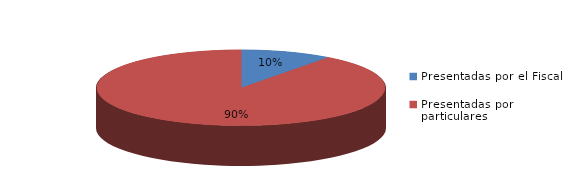
| Category | Series 0 |
|---|---|
| Presentadas por el Fiscal | 28 |
| Presentadas por particulares | 247 |